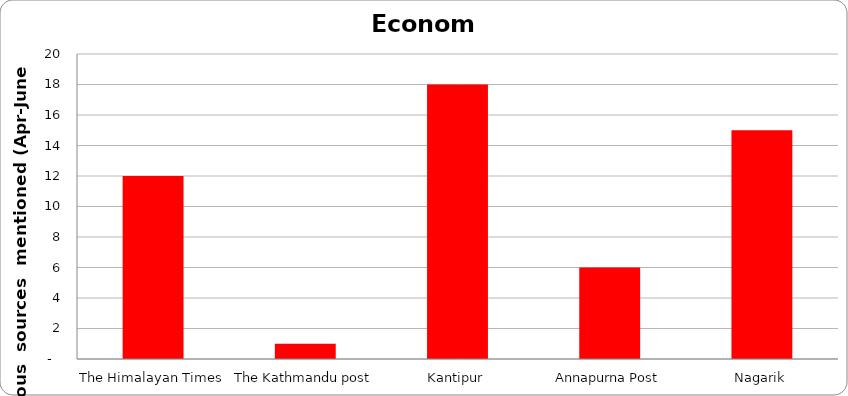
| Category | Economy |
|---|---|
| The Himalayan Times | 12 |
| The Kathmandu post | 1 |
| Kantipur | 18 |
| Annapurna Post | 6 |
| Nagarik | 15 |